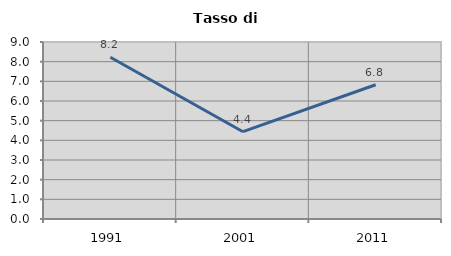
| Category | Tasso di disoccupazione   |
|---|---|
| 1991.0 | 8.222 |
| 2001.0 | 4.44 |
| 2011.0 | 6.825 |